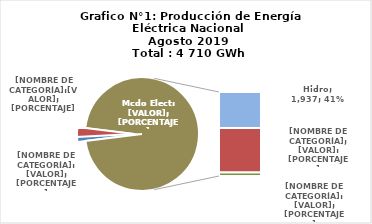
| Category | Series 0 |
|---|---|
| 0 | 52.999 |
| 1 | 129.757 |
| 2 | 1937.483 |
| 3 | 2399.158 |
| 4 | 190.82 |